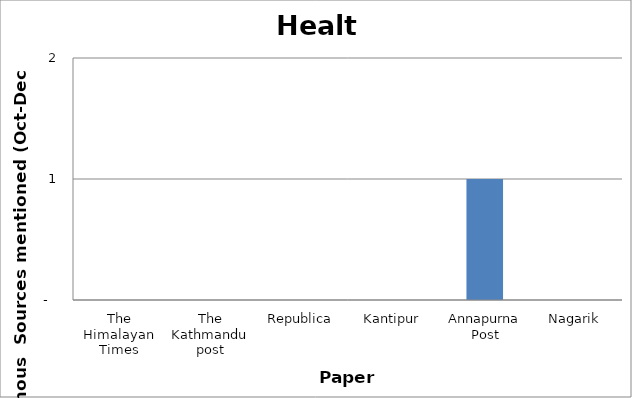
| Category | Health |
|---|---|
| The Himalayan Times | 0 |
| The Kathmandu post | 0 |
| Republica | 0 |
| Kantipur | 0 |
| Annapurna Post | 1 |
| Nagarik | 0 |